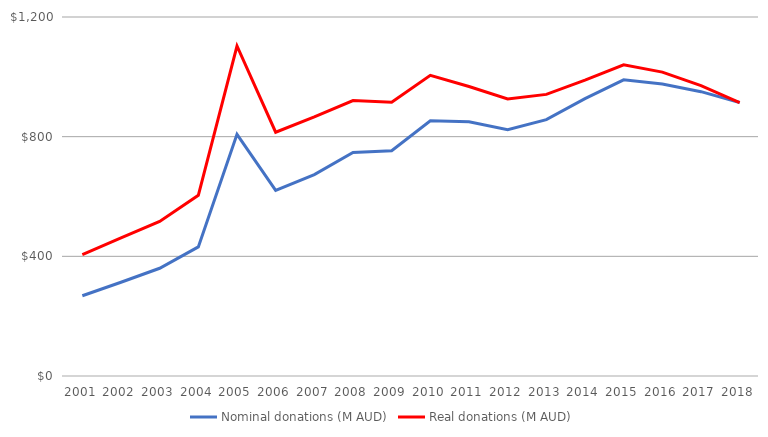
| Category | Nominal donations (M AUD) | Real donations (M AUD) |
|---|---|---|
| 2001.0 | 268.341 | 406.047 |
| 2002.0 | 313.462 | 461.404 |
| 2003.0 | 360.088 | 516.604 |
| 2004.0 | 431.592 | 604.086 |
| 2005.0 | 807.781 | 1103.049 |
| 2006.0 | 620.615 | 814.875 |
| 2007.0 | 673.304 | 865.872 |
| 2008.0 | 747.474 | 920.742 |
| 2009.0 | 752.972 | 914.708 |
| 2010.0 | 852.841 | 1004.878 |
| 2011.0 | 849.914 | 967.564 |
| 2012.0 | 823.396 | 926.261 |
| 2013.0 | 856.93 | 941.391 |
| 2014.0 | 926.991 | 988.696 |
| 2015.0 | 990.114 | 1040.414 |
| 2016.0 | 976.257 | 1015.696 |
| 2017.0 | 950.387 | 970.345 |
| 2018.0 | 914.132 | 914.132 |